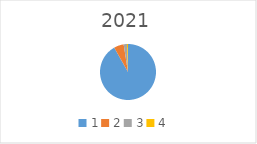
| Category | Series 0 |
|---|---|
| 1.0 | 830958.8 |
| 2.0 | 51422.26 |
| 3.0 | 17517.43 |
| 4.0 | 5105.75 |